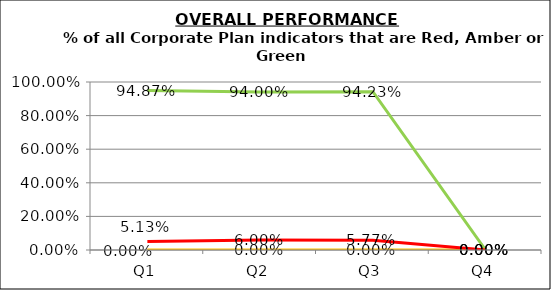
| Category | Green | Amber | Red |
|---|---|---|---|
| Q1 | 0.949 | 0 | 0.051 |
| Q2 | 0.94 | 0 | 0.06 |
| Q3 | 0.942 | 0 | 0.058 |
| Q4 | 0 | 0 | 0 |